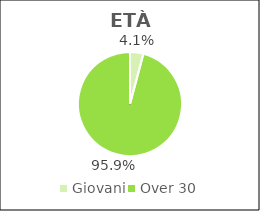
| Category | Series 0 |
|---|---|
| Giovani | 2881 |
| Over 30 | 66610 |